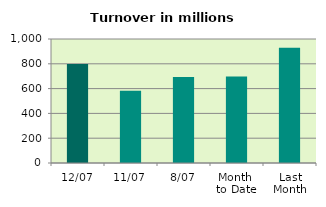
| Category | Series 0 |
|---|---|
| 12/07 | 797.535 |
| 11/07 | 582.532 |
| 8/07 | 693.352 |
| Month 
to Date | 698.22 |
| Last
Month | 929.439 |